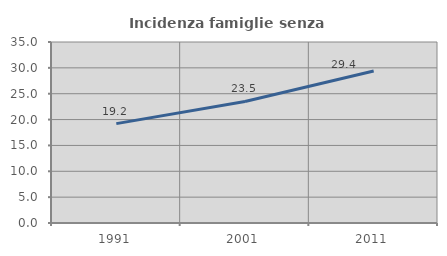
| Category | Incidenza famiglie senza nuclei |
|---|---|
| 1991.0 | 19.212 |
| 2001.0 | 23.508 |
| 2011.0 | 29.376 |